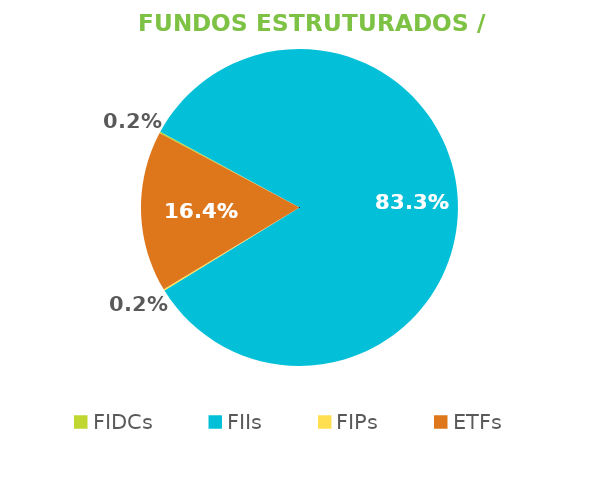
| Category | Fundos Estruturados / ETFs |
|---|---|
| FIDCs | 0.002 |
| FIIs | 0.833 |
| FIPs | 0.002 |
| ETFs | 0.164 |